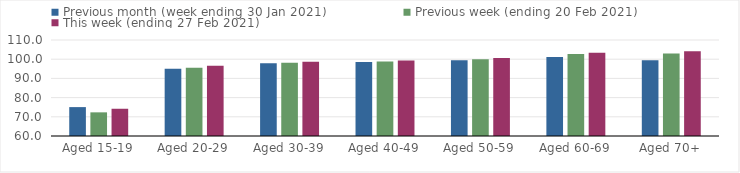
| Category | Previous month (week ending 30 Jan 2021) | Previous week (ending 20 Feb 2021) | This week (ending 27 Feb 2021) |
|---|---|---|---|
| Aged 15-19 | 75.05 | 72.32 | 74.19 |
| Aged 20-29 | 95.09 | 95.61 | 96.61 |
| Aged 30-39 | 97.9 | 98.13 | 98.67 |
| Aged 40-49 | 98.53 | 98.86 | 99.38 |
| Aged 50-59 | 99.46 | 100 | 100.57 |
| Aged 60-69 | 101.13 | 102.73 | 103.4 |
| Aged 70+ | 99.44 | 102.94 | 104.08 |